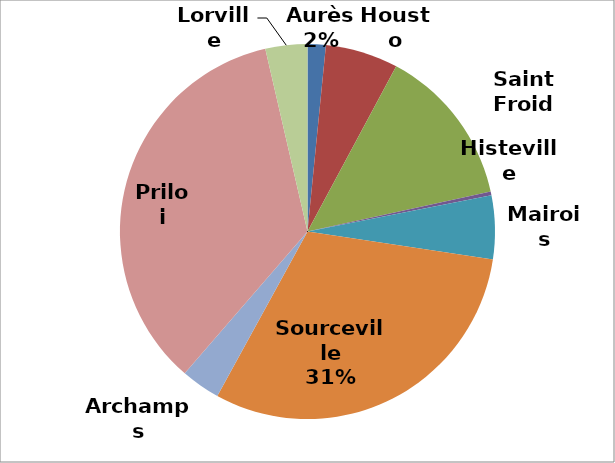
| Category | Series 0 | Series 1 |
|---|---|---|
| Aurès | 400000 | 510000 |
| Housto | 1600000 | 1830000 |
| Saint Froid | 3500000 | 5800000 |
| Histeville | 85000 | 90000 |
| Mairois | 1400000 | 3300000 |
| Sourceville | 7800000 | 8300000 |
| Archamps | 860000 | 790000 |
| Priloi | 8930000 | 9310000 |
| Lorville | 922000 | 1560000 |